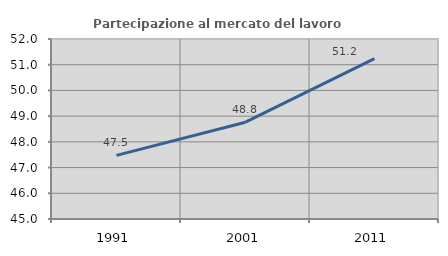
| Category | Partecipazione al mercato del lavoro  femminile |
|---|---|
| 1991.0 | 47.475 |
| 2001.0 | 48.765 |
| 2011.0 | 51.236 |